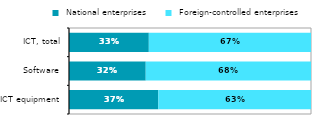
| Category |  National enterprises |  Foreign-controlled enterprises |
|---|---|---|
| ICT equipment | 0.369 | 0.631 |
| Software | 0.317 | 0.683 |
| ICT, total | 0.33 | 0.67 |